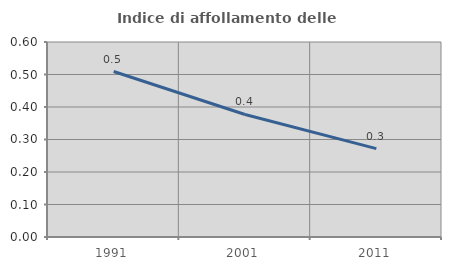
| Category | Indice di affollamento delle abitazioni  |
|---|---|
| 1991.0 | 0.509 |
| 2001.0 | 0.377 |
| 2011.0 | 0.272 |